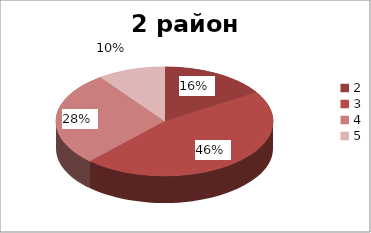
| Category | Series 0 |
|---|---|
| 2.0 | 0.16 |
| 3.0 | 0.46 |
| 4.0 | 0.28 |
| 5.0 | 0.1 |